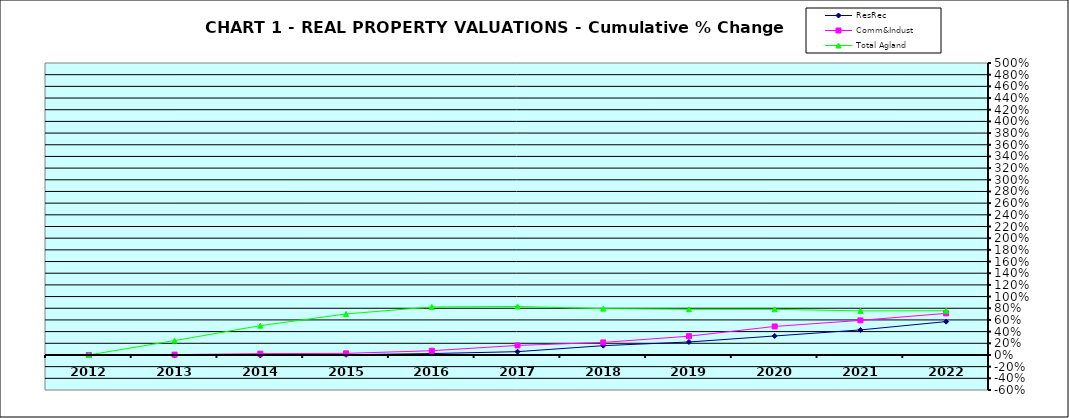
| Category | ResRec | Comm&Indust | Total Agland |
|---|---|---|---|
| 2012.0 | 0 | 0 | 0 |
| 2013.0 | -0.007 | 0.005 | 0.246 |
| 2014.0 | -0.008 | 0.022 | 0.502 |
| 2015.0 | 0.004 | 0.028 | 0.703 |
| 2016.0 | 0.024 | 0.073 | 0.822 |
| 2017.0 | 0.057 | 0.163 | 0.831 |
| 2018.0 | 0.159 | 0.215 | 0.793 |
| 2019.0 | 0.222 | 0.321 | 0.782 |
| 2020.0 | 0.325 | 0.488 | 0.782 |
| 2021.0 | 0.429 | 0.592 | 0.755 |
| 2022.0 | 0.571 | 0.712 | 0.757 |